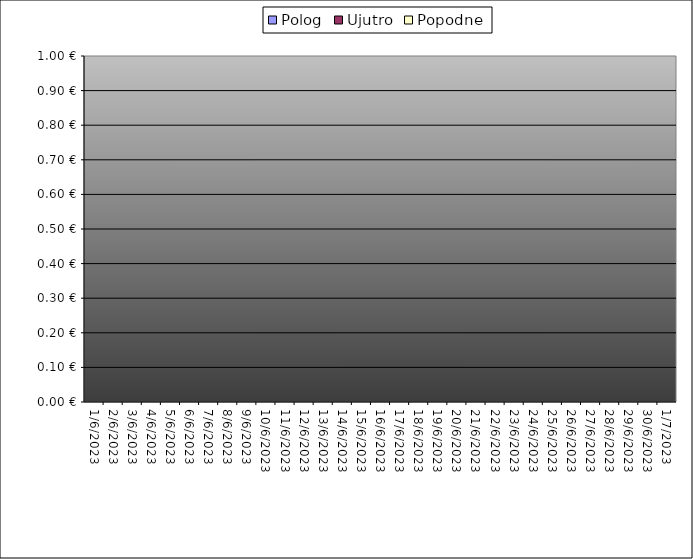
| Category | Polog | Ujutro | Popodne |
|---|---|---|---|
| 2023-06-01 |  | 0 | 0 |
| 2023-06-02 |  | 0 | 0 |
| 2023-06-03 |  | 0 | 0 |
| 2023-06-04 |  | 0 | 0 |
| 2023-06-05 |  | 0 | 0 |
| 2023-06-06 |  | 0 | 0 |
| 2023-06-07 |  | 0 | 0 |
| 2023-06-08 |  | 0 | 0 |
| 2023-06-09 |  | 0 | 0 |
| 2023-06-10 |  | 0 | 0 |
| 2023-06-11 |  | 0 | 0 |
| 2023-06-12 |  | 0 | 0 |
| 2023-06-13 |  | 0 | 0 |
| 2023-06-14 |  | 0 | 0 |
| 2023-06-15 |  | 0 | 0 |
| 2023-06-16 |  | 0 | 0 |
| 2023-06-17 |  | 0 | 0 |
| 2023-06-18 |  | 0 | 0 |
| 2023-06-19 |  | 0 | 0 |
| 2023-06-20 |  | 0 | 0 |
| 2023-06-21 |  | 0 | 0 |
| 2023-06-22 |  | 0 | 0 |
| 2023-06-23 |  | 0 | 0 |
| 2023-06-24 |  | 0 | 0 |
| 2023-06-25 |  | 0 | 0 |
| 2023-06-26 |  | 0 | 0 |
| 2023-06-27 |  | 0 | 0 |
| 2023-06-28 |  | 0 | 0 |
| 2023-06-29 |  | 0 | 0 |
| 2023-06-30 |  | 0 | 0 |
| 2023-07-01 |  | 0 | 0 |